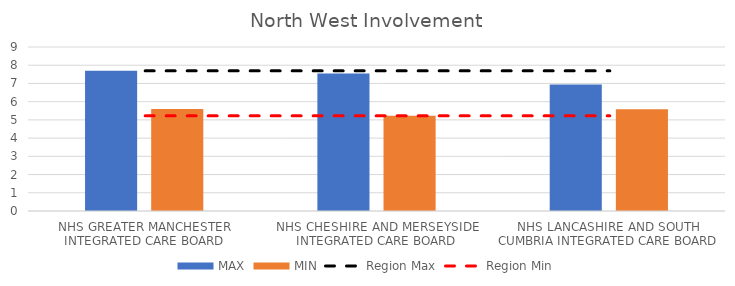
| Category | MAX | MIN |
|---|---|---|
| NHS GREATER MANCHESTER INTEGRATED CARE BOARD | 7.692 | 5.597 |
| NHS CHESHIRE AND MERSEYSIDE INTEGRATED CARE BOARD | 7.539 | 5.221 |
| NHS LANCASHIRE AND SOUTH CUMBRIA INTEGRATED CARE BOARD | 6.945 | 5.587 |